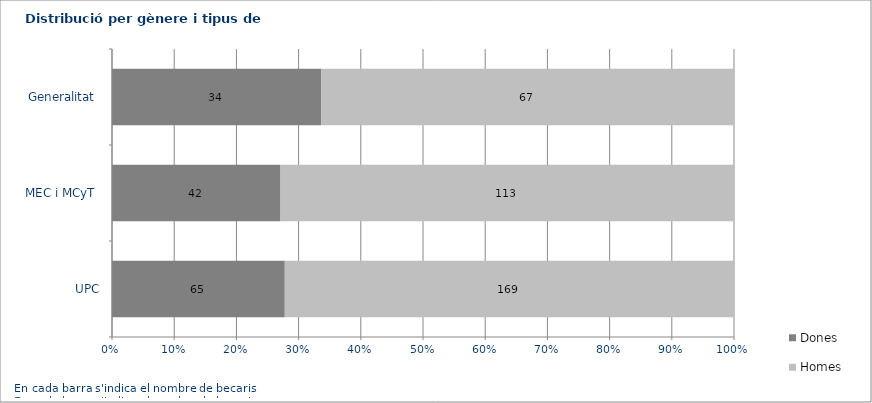
| Category | Dones | Homes |
|---|---|---|
| UPC | 65 | 169 |
| MEC i MCyT  | 42 | 113 |
| Generalitat  | 34 | 67 |